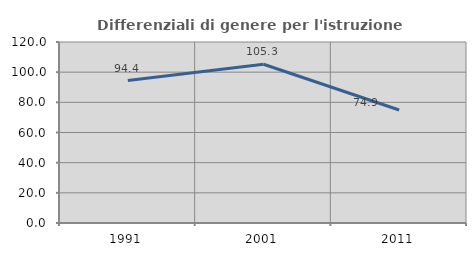
| Category | Differenziali di genere per l'istruzione superiore |
|---|---|
| 1991.0 | 94.42 |
| 2001.0 | 105.263 |
| 2011.0 | 74.926 |